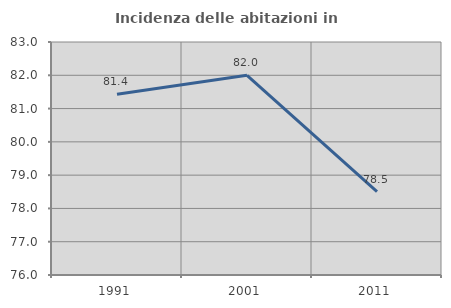
| Category | Incidenza delle abitazioni in proprietà  |
|---|---|
| 1991.0 | 81.429 |
| 2001.0 | 81.999 |
| 2011.0 | 78.503 |